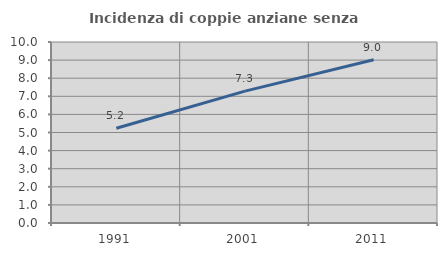
| Category | Incidenza di coppie anziane senza figli  |
|---|---|
| 1991.0 | 5.235 |
| 2001.0 | 7.287 |
| 2011.0 | 9.019 |